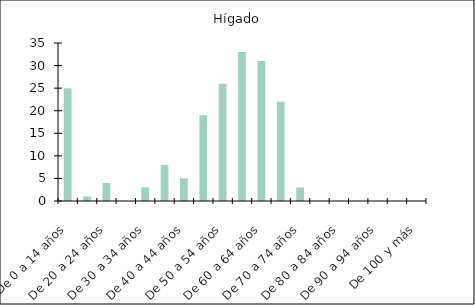
| Category | Hígado |
|---|---|
| De 0 a 14 años | 25 |
| De 15 a 19 años | 1 |
| De 20 a 24 años | 4 |
| De 25 a 29 años | 0 |
| De 30 a 34 años | 3 |
| De 35 a 39 años | 8 |
| De 40 a 44 años | 5 |
| De 45 a 49 años | 19 |
| De 50 a 54 años | 26 |
| De 55 a 59 años | 33 |
| De 60 a 64 años | 31 |
| De 65 a 69 años | 22 |
| De 70 a 74 años | 3 |
| De 75 a 79 años | 0 |
| De 80 a 84 años | 0 |
| De 85 a 89 años | 0 |
| De 90 a 94 años | 0 |
| De 95 a 99 años | 0 |
| De 100 y más | 0 |